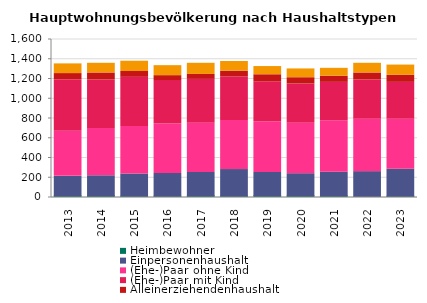
| Category | Heimbewohner | Einpersonenhaushalt | (Ehe-)Paar ohne Kind | (Ehe-)Paar mit Kind | Alleinerziehendenhaushalt | sonstiger Mehrpersonenhaushalt |
|---|---|---|---|---|---|---|
| 2013.0 | 17 | 197 | 458 | 521 | 62 | 98 |
| 2014.0 | 17 | 203 | 479 | 491 | 71 | 98 |
| 2015.0 | 14 | 224 | 482 | 497 | 59 | 104 |
| 2016.0 | 14 | 230 | 500 | 440 | 50 | 101 |
| 2017.0 | 17 | 236 | 500 | 443 | 50 | 113 |
| 2018.0 | 14 | 269 | 497 | 440 | 59 | 98 |
| 2019.0 | 17 | 236 | 515 | 404 | 71 | 83 |
| 2020.0 | 17 | 224 | 512 | 395 | 65 | 89 |
| 2021.0 | 17 | 239 | 521 | 389 | 62 | 80 |
| 2022.0 | 2 | 260 | 530 | 398 | 71 | 98 |
| 2023.0 | 14 | 272 | 506 | 374 | 71 | 104 |